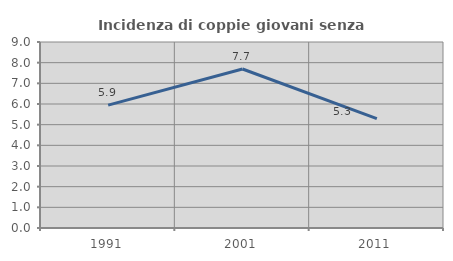
| Category | Incidenza di coppie giovani senza figli |
|---|---|
| 1991.0 | 5.947 |
| 2001.0 | 7.692 |
| 2011.0 | 5.295 |